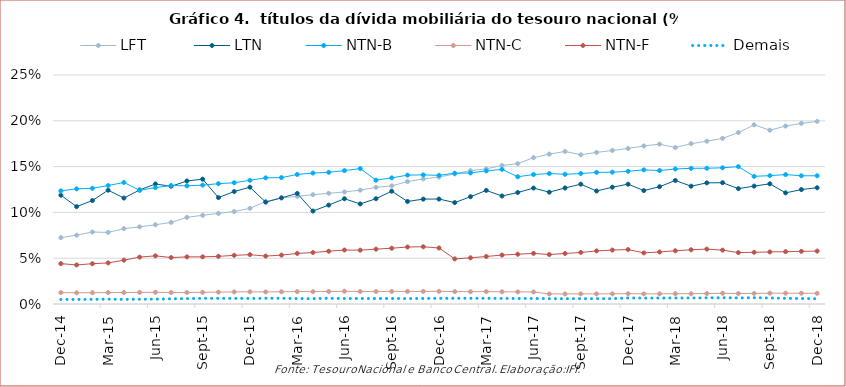
| Category | LFT  | LTN | NTN-B | NTN-C | NTN-F | Demais |
|---|---|---|---|---|---|---|
| 2014-12-01 | 0.072 | 0.119 | 0.123 | 0.012 | 0.044 | 0.005 |
| 2015-01-01 | 0.075 | 0.106 | 0.126 | 0.012 | 0.043 | 0.005 |
| 2015-02-01 | 0.079 | 0.113 | 0.126 | 0.012 | 0.044 | 0.005 |
| 2015-03-01 | 0.078 | 0.124 | 0.129 | 0.012 | 0.045 | 0.005 |
| 2015-04-01 | 0.082 | 0.116 | 0.133 | 0.013 | 0.048 | 0.005 |
| 2015-05-01 | 0.084 | 0.125 | 0.124 | 0.013 | 0.051 | 0.005 |
| 2015-06-01 | 0.087 | 0.131 | 0.127 | 0.013 | 0.053 | 0.005 |
| 2015-07-01 | 0.089 | 0.129 | 0.129 | 0.013 | 0.051 | 0.006 |
| 2015-08-01 | 0.095 | 0.134 | 0.129 | 0.013 | 0.051 | 0.006 |
| 2015-09-01 | 0.097 | 0.136 | 0.13 | 0.013 | 0.051 | 0.006 |
| 2015-10-01 | 0.099 | 0.116 | 0.131 | 0.013 | 0.052 | 0.006 |
| 2015-11-01 | 0.101 | 0.123 | 0.132 | 0.013 | 0.053 | 0.006 |
| 2015-12-01 | 0.104 | 0.128 | 0.135 | 0.013 | 0.054 | 0.006 |
| 2016-01-01 | 0.112 | 0.111 | 0.138 | 0.013 | 0.052 | 0.006 |
| 2016-02-01 | 0.116 | 0.116 | 0.138 | 0.013 | 0.053 | 0.006 |
| 2016-03-01 | 0.118 | 0.121 | 0.141 | 0.014 | 0.055 | 0.006 |
| 2016-04-01 | 0.119 | 0.101 | 0.143 | 0.014 | 0.056 | 0.006 |
| 2016-05-01 | 0.121 | 0.108 | 0.144 | 0.014 | 0.058 | 0.006 |
| 2016-06-01 | 0.122 | 0.115 | 0.146 | 0.014 | 0.059 | 0.006 |
| 2016-07-01 | 0.124 | 0.109 | 0.148 | 0.014 | 0.059 | 0.006 |
| 2016-08-01 | 0.127 | 0.115 | 0.135 | 0.014 | 0.06 | 0.006 |
| 2016-09-01 | 0.129 | 0.123 | 0.138 | 0.014 | 0.061 | 0.006 |
| 2016-10-01 | 0.134 | 0.112 | 0.141 | 0.014 | 0.062 | 0.006 |
| 2016-11-01 | 0.137 | 0.115 | 0.141 | 0.014 | 0.063 | 0.006 |
| 2016-12-01 | 0.139 | 0.115 | 0.14 | 0.014 | 0.061 | 0.006 |
| 2017-01-01 | 0.142 | 0.111 | 0.143 | 0.014 | 0.049 | 0.006 |
| 2017-02-01 | 0.146 | 0.117 | 0.143 | 0.013 | 0.05 | 0.006 |
| 2017-03-01 | 0.148 | 0.124 | 0.145 | 0.014 | 0.052 | 0.006 |
| 2017-04-01 | 0.151 | 0.118 | 0.147 | 0.013 | 0.053 | 0.006 |
| 2017-05-01 | 0.153 | 0.122 | 0.139 | 0.013 | 0.054 | 0.006 |
| 2017-06-01 | 0.16 | 0.127 | 0.141 | 0.013 | 0.055 | 0.006 |
| 2017-07-01 | 0.164 | 0.122 | 0.142 | 0.011 | 0.054 | 0.006 |
| 2017-08-01 | 0.167 | 0.127 | 0.142 | 0.011 | 0.055 | 0.006 |
| 2017-09-01 | 0.163 | 0.131 | 0.142 | 0.011 | 0.056 | 0.006 |
| 2017-10-01 | 0.165 | 0.123 | 0.144 | 0.011 | 0.058 | 0.006 |
| 2017-11-01 | 0.168 | 0.127 | 0.144 | 0.011 | 0.059 | 0.006 |
| 2017-12-01 | 0.17 | 0.131 | 0.145 | 0.011 | 0.059 | 0.007 |
| 2018-01-01 | 0.173 | 0.124 | 0.146 | 0.011 | 0.056 | 0.006 |
| 2018-02-01 | 0.175 | 0.128 | 0.146 | 0.011 | 0.057 | 0.006 |
| 2018-03-01 | 0.171 | 0.135 | 0.147 | 0.011 | 0.058 | 0.007 |
| 2018-04-01 | 0.175 | 0.129 | 0.148 | 0.011 | 0.059 | 0.007 |
| 2018-05-01 | 0.178 | 0.132 | 0.148 | 0.011 | 0.06 | 0.007 |
| 2018-06-01 | 0.181 | 0.132 | 0.149 | 0.012 | 0.059 | 0.007 |
| 2018-07-01 | 0.187 | 0.126 | 0.15 | 0.011 | 0.056 | 0.007 |
| 2018-08-01 | 0.196 | 0.129 | 0.139 | 0.012 | 0.056 | 0.007 |
| 2018-09-01 | 0.19 | 0.131 | 0.14 | 0.012 | 0.057 | 0.007 |
| 2018-10-01 | 0.194 | 0.121 | 0.141 | 0.012 | 0.057 | 0.006 |
| 2018-11-01 | 0.197 | 0.125 | 0.14 | 0.012 | 0.057 | 0.006 |
| 2018-12-01 | 0.199 | 0.127 | 0.14 | 0.012 | 0.058 | 0.006 |